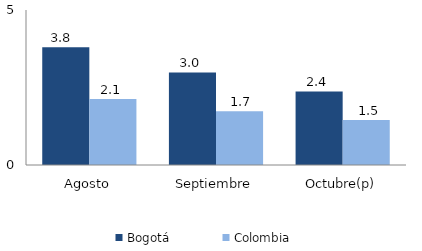
| Category | Bogotá | Colombia |
|---|---|---|
| Agosto | 3.796 | 2.131 |
| Septiembre | 2.988 | 1.732 |
| Octubre(p) | 2.373 | 1.454 |